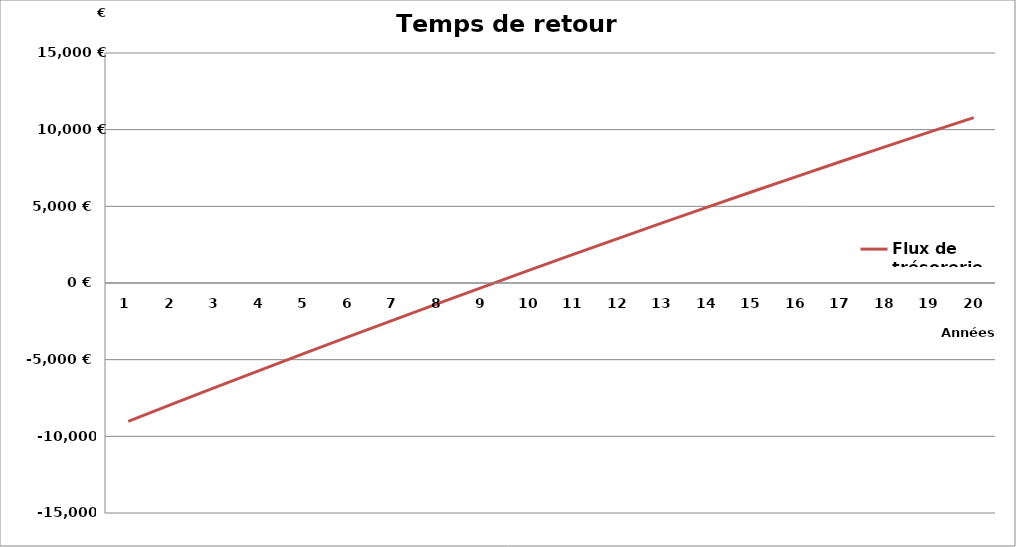
| Category | Flux de trésorerie |
|---|---|
| 0 | -9020.366 |
| 1 | -7886.735 |
| 2 | -6763.122 |
| 3 | -5649.541 |
| 4 | -4546.009 |
| 5 | -3452.542 |
| 6 | -2369.159 |
| 7 | -1295.878 |
| 8 | -232.72 |
| 9 | 820.296 |
| 10 | 1863.148 |
| 11 | 2895.812 |
| 12 | 3918.265 |
| 13 | 4930.483 |
| 14 | 5932.44 |
| 15 | 6924.108 |
| 16 | 7905.462 |
| 17 | 8876.471 |
| 18 | 9837.105 |
| 19 | 10787.335 |